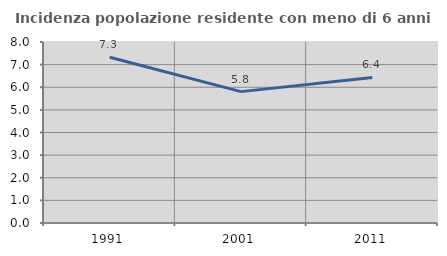
| Category | Incidenza popolazione residente con meno di 6 anni |
|---|---|
| 1991.0 | 7.325 |
| 2001.0 | 5.806 |
| 2011.0 | 6.433 |